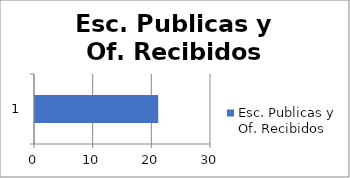
| Category | Esc. Publicas y Of. Recibidos |
|---|---|
| 0 | 21 |